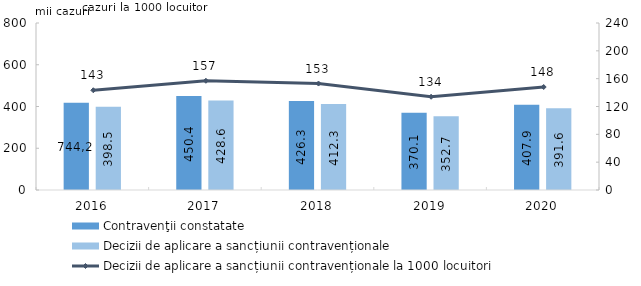
| Category | Contravenţii constatate | Decizii de aplicare a sancțiunii contravenționale |
|---|---|---|
| 2016.0 | 417.5 | 398.5 |
| 2017.0 | 450.4 | 428.6 |
| 2018.0 | 426.3 | 412.3 |
| 2019.0 | 370.1 | 352.7 |
| 2020.0 | 407.9 | 391.6 |